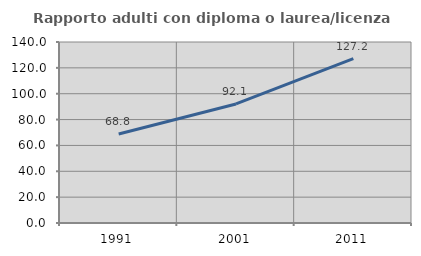
| Category | Rapporto adulti con diploma o laurea/licenza media  |
|---|---|
| 1991.0 | 68.825 |
| 2001.0 | 92.072 |
| 2011.0 | 127.18 |